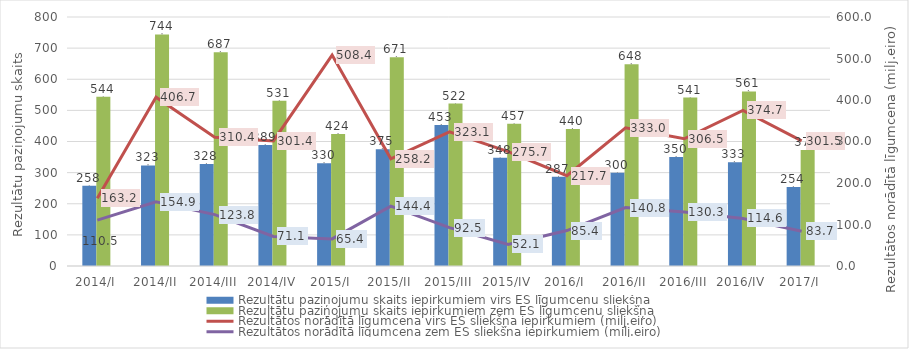
| Category | Rezultātu paziņojumu skaits iepirkumiem virs ES līgumcenu sliekšņa | Rezultātu paziņojumu skaits iepirkumiem zem ES līgumcenu sliekšņa |
|---|---|---|
| 2014/I | 258 | 544 |
| 2014/II | 323 | 744 |
| 2014/III | 328 | 687 |
| 2014/IV | 389 | 531 |
| 2015/I | 330 | 424 |
| 2015/II | 375 | 671 |
| 2015/III | 453 | 522 |
| 2015/IV | 348 | 457 |
| 2016/I | 287 | 440 |
| 2016/II | 300 | 648 |
| 2016/III | 350 | 541 |
| 2016/IV | 333 | 561 |
| 2017/I | 254 | 373 |